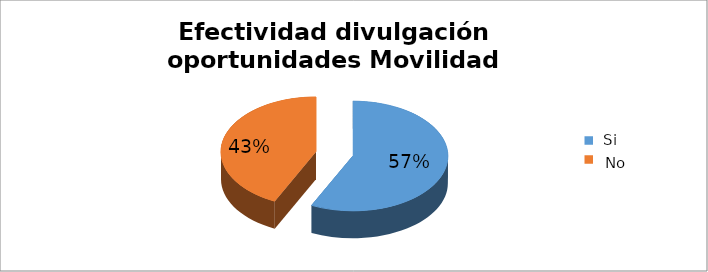
| Category | Series 0 |
|---|---|
| 0 | 0.571 |
| 1 | 0.429 |